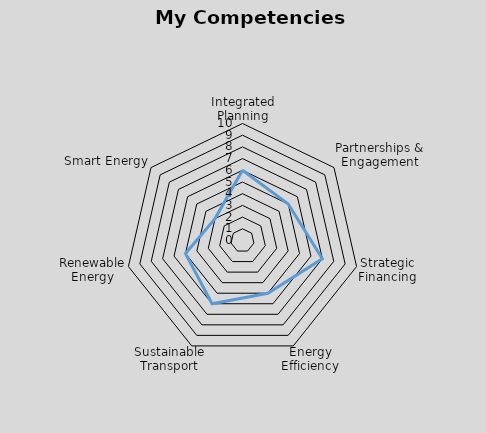
| Category | Series 0 |
|---|---|
| Integrated Planning | 6 |
| Partnerships & Engagement | 5 |
| Strategic Financing | 7 |
| Energy Efficiency | 5 |
| Sustainable Transport | 6 |
| Renewable Energy | 5 |
| Smart Energy | 3 |